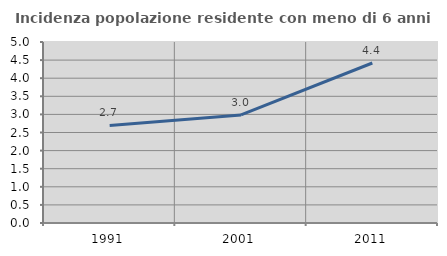
| Category | Incidenza popolazione residente con meno di 6 anni |
|---|---|
| 1991.0 | 2.696 |
| 2001.0 | 2.985 |
| 2011.0 | 4.419 |